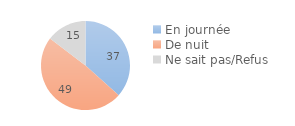
| Category | Series 0 |
|---|---|
| En journée | 36.605 |
| De nuit | 48.719 |
| Ne sait pas/Refus | 14.676 |